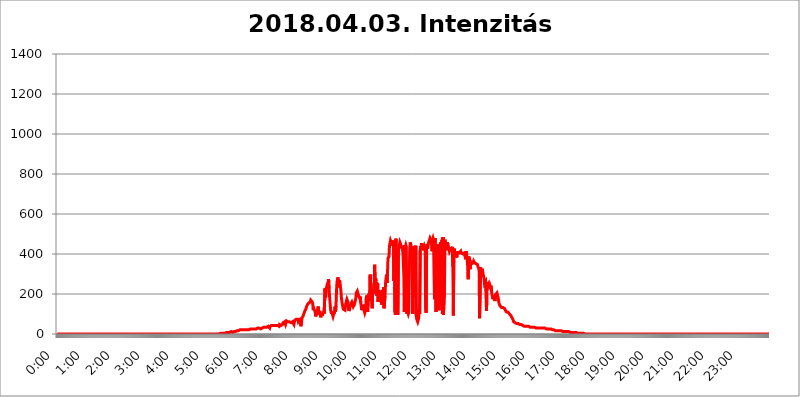
| Category | 2018.04.03. Intenzitás [W/m^2] |
|---|---|
| 0.0 | 0 |
| 0.0006944444444444445 | 0 |
| 0.001388888888888889 | 0 |
| 0.0020833333333333333 | 0 |
| 0.002777777777777778 | 0 |
| 0.003472222222222222 | 0 |
| 0.004166666666666667 | 0 |
| 0.004861111111111111 | 0 |
| 0.005555555555555556 | 0 |
| 0.0062499999999999995 | 0 |
| 0.006944444444444444 | 0 |
| 0.007638888888888889 | 0 |
| 0.008333333333333333 | 0 |
| 0.009027777777777779 | 0 |
| 0.009722222222222222 | 0 |
| 0.010416666666666666 | 0 |
| 0.011111111111111112 | 0 |
| 0.011805555555555555 | 0 |
| 0.012499999999999999 | 0 |
| 0.013194444444444444 | 0 |
| 0.013888888888888888 | 0 |
| 0.014583333333333332 | 0 |
| 0.015277777777777777 | 0 |
| 0.015972222222222224 | 0 |
| 0.016666666666666666 | 0 |
| 0.017361111111111112 | 0 |
| 0.018055555555555557 | 0 |
| 0.01875 | 0 |
| 0.019444444444444445 | 0 |
| 0.02013888888888889 | 0 |
| 0.020833333333333332 | 0 |
| 0.02152777777777778 | 0 |
| 0.022222222222222223 | 0 |
| 0.02291666666666667 | 0 |
| 0.02361111111111111 | 0 |
| 0.024305555555555556 | 0 |
| 0.024999999999999998 | 0 |
| 0.025694444444444447 | 0 |
| 0.02638888888888889 | 0 |
| 0.027083333333333334 | 0 |
| 0.027777777777777776 | 0 |
| 0.02847222222222222 | 0 |
| 0.029166666666666664 | 0 |
| 0.029861111111111113 | 0 |
| 0.030555555555555555 | 0 |
| 0.03125 | 0 |
| 0.03194444444444445 | 0 |
| 0.03263888888888889 | 0 |
| 0.03333333333333333 | 0 |
| 0.034027777777777775 | 0 |
| 0.034722222222222224 | 0 |
| 0.035416666666666666 | 0 |
| 0.036111111111111115 | 0 |
| 0.03680555555555556 | 0 |
| 0.0375 | 0 |
| 0.03819444444444444 | 0 |
| 0.03888888888888889 | 0 |
| 0.03958333333333333 | 0 |
| 0.04027777777777778 | 0 |
| 0.04097222222222222 | 0 |
| 0.041666666666666664 | 0 |
| 0.042361111111111106 | 0 |
| 0.04305555555555556 | 0 |
| 0.043750000000000004 | 0 |
| 0.044444444444444446 | 0 |
| 0.04513888888888889 | 0 |
| 0.04583333333333334 | 0 |
| 0.04652777777777778 | 0 |
| 0.04722222222222222 | 0 |
| 0.04791666666666666 | 0 |
| 0.04861111111111111 | 0 |
| 0.049305555555555554 | 0 |
| 0.049999999999999996 | 0 |
| 0.05069444444444445 | 0 |
| 0.051388888888888894 | 0 |
| 0.052083333333333336 | 0 |
| 0.05277777777777778 | 0 |
| 0.05347222222222222 | 0 |
| 0.05416666666666667 | 0 |
| 0.05486111111111111 | 0 |
| 0.05555555555555555 | 0 |
| 0.05625 | 0 |
| 0.05694444444444444 | 0 |
| 0.057638888888888885 | 0 |
| 0.05833333333333333 | 0 |
| 0.05902777777777778 | 0 |
| 0.059722222222222225 | 0 |
| 0.06041666666666667 | 0 |
| 0.061111111111111116 | 0 |
| 0.06180555555555556 | 0 |
| 0.0625 | 0 |
| 0.06319444444444444 | 0 |
| 0.06388888888888888 | 0 |
| 0.06458333333333334 | 0 |
| 0.06527777777777778 | 0 |
| 0.06597222222222222 | 0 |
| 0.06666666666666667 | 0 |
| 0.06736111111111111 | 0 |
| 0.06805555555555555 | 0 |
| 0.06874999999999999 | 0 |
| 0.06944444444444443 | 0 |
| 0.07013888888888889 | 0 |
| 0.07083333333333333 | 0 |
| 0.07152777777777779 | 0 |
| 0.07222222222222223 | 0 |
| 0.07291666666666667 | 0 |
| 0.07361111111111111 | 0 |
| 0.07430555555555556 | 0 |
| 0.075 | 0 |
| 0.07569444444444444 | 0 |
| 0.0763888888888889 | 0 |
| 0.07708333333333334 | 0 |
| 0.07777777777777778 | 0 |
| 0.07847222222222222 | 0 |
| 0.07916666666666666 | 0 |
| 0.0798611111111111 | 0 |
| 0.08055555555555556 | 0 |
| 0.08125 | 0 |
| 0.08194444444444444 | 0 |
| 0.08263888888888889 | 0 |
| 0.08333333333333333 | 0 |
| 0.08402777777777777 | 0 |
| 0.08472222222222221 | 0 |
| 0.08541666666666665 | 0 |
| 0.08611111111111112 | 0 |
| 0.08680555555555557 | 0 |
| 0.08750000000000001 | 0 |
| 0.08819444444444445 | 0 |
| 0.08888888888888889 | 0 |
| 0.08958333333333333 | 0 |
| 0.09027777777777778 | 0 |
| 0.09097222222222222 | 0 |
| 0.09166666666666667 | 0 |
| 0.09236111111111112 | 0 |
| 0.09305555555555556 | 0 |
| 0.09375 | 0 |
| 0.09444444444444444 | 0 |
| 0.09513888888888888 | 0 |
| 0.09583333333333333 | 0 |
| 0.09652777777777777 | 0 |
| 0.09722222222222222 | 0 |
| 0.09791666666666667 | 0 |
| 0.09861111111111111 | 0 |
| 0.09930555555555555 | 0 |
| 0.09999999999999999 | 0 |
| 0.10069444444444443 | 0 |
| 0.1013888888888889 | 0 |
| 0.10208333333333335 | 0 |
| 0.10277777777777779 | 0 |
| 0.10347222222222223 | 0 |
| 0.10416666666666667 | 0 |
| 0.10486111111111111 | 0 |
| 0.10555555555555556 | 0 |
| 0.10625 | 0 |
| 0.10694444444444444 | 0 |
| 0.1076388888888889 | 0 |
| 0.10833333333333334 | 0 |
| 0.10902777777777778 | 0 |
| 0.10972222222222222 | 0 |
| 0.1111111111111111 | 0 |
| 0.11180555555555556 | 0 |
| 0.11180555555555556 | 0 |
| 0.1125 | 0 |
| 0.11319444444444444 | 0 |
| 0.11388888888888889 | 0 |
| 0.11458333333333333 | 0 |
| 0.11527777777777777 | 0 |
| 0.11597222222222221 | 0 |
| 0.11666666666666665 | 0 |
| 0.1173611111111111 | 0 |
| 0.11805555555555557 | 0 |
| 0.11944444444444445 | 0 |
| 0.12013888888888889 | 0 |
| 0.12083333333333333 | 0 |
| 0.12152777777777778 | 0 |
| 0.12222222222222223 | 0 |
| 0.12291666666666667 | 0 |
| 0.12291666666666667 | 0 |
| 0.12361111111111112 | 0 |
| 0.12430555555555556 | 0 |
| 0.125 | 0 |
| 0.12569444444444444 | 0 |
| 0.12638888888888888 | 0 |
| 0.12708333333333333 | 0 |
| 0.16875 | 0 |
| 0.12847222222222224 | 0 |
| 0.12916666666666668 | 0 |
| 0.12986111111111112 | 0 |
| 0.13055555555555556 | 0 |
| 0.13125 | 0 |
| 0.13194444444444445 | 0 |
| 0.1326388888888889 | 0 |
| 0.13333333333333333 | 0 |
| 0.13402777777777777 | 0 |
| 0.13402777777777777 | 0 |
| 0.13472222222222222 | 0 |
| 0.13541666666666666 | 0 |
| 0.1361111111111111 | 0 |
| 0.13749999999999998 | 0 |
| 0.13819444444444443 | 0 |
| 0.1388888888888889 | 0 |
| 0.13958333333333334 | 0 |
| 0.14027777777777778 | 0 |
| 0.14097222222222222 | 0 |
| 0.14166666666666666 | 0 |
| 0.1423611111111111 | 0 |
| 0.14305555555555557 | 0 |
| 0.14375000000000002 | 0 |
| 0.14444444444444446 | 0 |
| 0.1451388888888889 | 0 |
| 0.1451388888888889 | 0 |
| 0.14652777777777778 | 0 |
| 0.14722222222222223 | 0 |
| 0.14791666666666667 | 0 |
| 0.1486111111111111 | 0 |
| 0.14930555555555555 | 0 |
| 0.15 | 0 |
| 0.15069444444444444 | 0 |
| 0.15138888888888888 | 0 |
| 0.15208333333333332 | 0 |
| 0.15277777777777776 | 0 |
| 0.15347222222222223 | 0 |
| 0.15416666666666667 | 0 |
| 0.15486111111111112 | 0 |
| 0.15555555555555556 | 0 |
| 0.15625 | 0 |
| 0.15694444444444444 | 0 |
| 0.15763888888888888 | 0 |
| 0.15833333333333333 | 0 |
| 0.15902777777777777 | 0 |
| 0.15972222222222224 | 0 |
| 0.16041666666666668 | 0 |
| 0.16111111111111112 | 0 |
| 0.16180555555555556 | 0 |
| 0.1625 | 0 |
| 0.16319444444444445 | 0 |
| 0.1638888888888889 | 0 |
| 0.16458333333333333 | 0 |
| 0.16527777777777777 | 0 |
| 0.16597222222222222 | 0 |
| 0.16666666666666666 | 0 |
| 0.1673611111111111 | 0 |
| 0.16805555555555554 | 0 |
| 0.16874999999999998 | 0 |
| 0.16944444444444443 | 0 |
| 0.17013888888888887 | 0 |
| 0.1708333333333333 | 0 |
| 0.17152777777777775 | 0 |
| 0.17222222222222225 | 0 |
| 0.1729166666666667 | 0 |
| 0.17361111111111113 | 0 |
| 0.17430555555555557 | 0 |
| 0.17500000000000002 | 0 |
| 0.17569444444444446 | 0 |
| 0.1763888888888889 | 0 |
| 0.17708333333333334 | 0 |
| 0.17777777777777778 | 0 |
| 0.17847222222222223 | 0 |
| 0.17916666666666667 | 0 |
| 0.1798611111111111 | 0 |
| 0.18055555555555555 | 0 |
| 0.18125 | 0 |
| 0.18194444444444444 | 0 |
| 0.1826388888888889 | 0 |
| 0.18333333333333335 | 0 |
| 0.1840277777777778 | 0 |
| 0.18472222222222223 | 0 |
| 0.18541666666666667 | 0 |
| 0.18611111111111112 | 0 |
| 0.18680555555555556 | 0 |
| 0.1875 | 0 |
| 0.18819444444444444 | 0 |
| 0.18888888888888888 | 0 |
| 0.18958333333333333 | 0 |
| 0.19027777777777777 | 0 |
| 0.1909722222222222 | 0 |
| 0.19166666666666665 | 0 |
| 0.19236111111111112 | 0 |
| 0.19305555555555554 | 0 |
| 0.19375 | 0 |
| 0.19444444444444445 | 0 |
| 0.1951388888888889 | 0 |
| 0.19583333333333333 | 0 |
| 0.19652777777777777 | 0 |
| 0.19722222222222222 | 0 |
| 0.19791666666666666 | 0 |
| 0.1986111111111111 | 0 |
| 0.19930555555555554 | 0 |
| 0.19999999999999998 | 0 |
| 0.20069444444444443 | 0 |
| 0.20138888888888887 | 0 |
| 0.2020833333333333 | 0 |
| 0.2027777777777778 | 0 |
| 0.2034722222222222 | 0 |
| 0.2041666666666667 | 0 |
| 0.20486111111111113 | 0 |
| 0.20555555555555557 | 0 |
| 0.20625000000000002 | 0 |
| 0.20694444444444446 | 0 |
| 0.2076388888888889 | 0 |
| 0.20833333333333334 | 0 |
| 0.20902777777777778 | 0 |
| 0.20972222222222223 | 0 |
| 0.21041666666666667 | 0 |
| 0.2111111111111111 | 0 |
| 0.21180555555555555 | 0 |
| 0.2125 | 0 |
| 0.21319444444444444 | 0 |
| 0.2138888888888889 | 0 |
| 0.21458333333333335 | 0 |
| 0.2152777777777778 | 0 |
| 0.21597222222222223 | 0 |
| 0.21666666666666667 | 0 |
| 0.21736111111111112 | 0 |
| 0.21805555555555556 | 0 |
| 0.21875 | 0 |
| 0.21944444444444444 | 0 |
| 0.22013888888888888 | 0 |
| 0.22083333333333333 | 0 |
| 0.22152777777777777 | 0 |
| 0.2222222222222222 | 0 |
| 0.22291666666666665 | 0 |
| 0.2236111111111111 | 0 |
| 0.22430555555555556 | 0 |
| 0.225 | 0 |
| 0.22569444444444445 | 0 |
| 0.2263888888888889 | 0 |
| 0.22708333333333333 | 0 |
| 0.22777777777777777 | 0 |
| 0.22847222222222222 | 0 |
| 0.22916666666666666 | 3.525 |
| 0.2298611111111111 | 3.525 |
| 0.23055555555555554 | 3.525 |
| 0.23124999999999998 | 3.525 |
| 0.23194444444444443 | 3.525 |
| 0.23263888888888887 | 3.525 |
| 0.2333333333333333 | 3.525 |
| 0.2340277777777778 | 3.525 |
| 0.2347222222222222 | 3.525 |
| 0.2354166666666667 | 3.525 |
| 0.23611111111111113 | 3.525 |
| 0.23680555555555557 | 7.887 |
| 0.23750000000000002 | 7.887 |
| 0.23819444444444446 | 7.887 |
| 0.2388888888888889 | 7.887 |
| 0.23958333333333334 | 7.887 |
| 0.24027777777777778 | 7.887 |
| 0.24097222222222223 | 7.887 |
| 0.24166666666666667 | 7.887 |
| 0.2423611111111111 | 7.887 |
| 0.24305555555555555 | 12.257 |
| 0.24375 | 12.257 |
| 0.24444444444444446 | 12.257 |
| 0.24513888888888888 | 12.257 |
| 0.24583333333333335 | 7.887 |
| 0.2465277777777778 | 12.257 |
| 0.24722222222222223 | 12.257 |
| 0.24791666666666667 | 12.257 |
| 0.24861111111111112 | 12.257 |
| 0.24930555555555556 | 12.257 |
| 0.25 | 12.257 |
| 0.25069444444444444 | 16.636 |
| 0.2513888888888889 | 16.636 |
| 0.2520833333333333 | 16.636 |
| 0.25277777777777777 | 16.636 |
| 0.2534722222222222 | 16.636 |
| 0.25416666666666665 | 16.636 |
| 0.2548611111111111 | 16.636 |
| 0.2555555555555556 | 16.636 |
| 0.25625000000000003 | 21.024 |
| 0.2569444444444445 | 21.024 |
| 0.2576388888888889 | 21.024 |
| 0.25833333333333336 | 21.024 |
| 0.2590277777777778 | 21.024 |
| 0.25972222222222224 | 21.024 |
| 0.2604166666666667 | 21.024 |
| 0.2611111111111111 | 21.024 |
| 0.26180555555555557 | 21.024 |
| 0.2625 | 21.024 |
| 0.26319444444444445 | 21.024 |
| 0.2638888888888889 | 21.024 |
| 0.26458333333333334 | 21.024 |
| 0.2652777777777778 | 21.024 |
| 0.2659722222222222 | 21.024 |
| 0.26666666666666666 | 21.024 |
| 0.2673611111111111 | 21.024 |
| 0.26805555555555555 | 21.024 |
| 0.26875 | 21.024 |
| 0.26944444444444443 | 25.419 |
| 0.2701388888888889 | 25.419 |
| 0.2708333333333333 | 25.419 |
| 0.27152777777777776 | 29.823 |
| 0.2722222222222222 | 25.419 |
| 0.27291666666666664 | 25.419 |
| 0.2736111111111111 | 25.419 |
| 0.2743055555555555 | 25.419 |
| 0.27499999999999997 | 25.419 |
| 0.27569444444444446 | 25.419 |
| 0.27638888888888885 | 25.419 |
| 0.27708333333333335 | 25.419 |
| 0.2777777777777778 | 25.419 |
| 0.27847222222222223 | 25.419 |
| 0.2791666666666667 | 25.419 |
| 0.2798611111111111 | 25.419 |
| 0.28055555555555556 | 25.419 |
| 0.28125 | 29.823 |
| 0.28194444444444444 | 25.419 |
| 0.2826388888888889 | 29.823 |
| 0.2833333333333333 | 29.823 |
| 0.28402777777777777 | 25.419 |
| 0.2847222222222222 | 25.419 |
| 0.28541666666666665 | 25.419 |
| 0.28611111111111115 | 25.419 |
| 0.28680555555555554 | 29.823 |
| 0.28750000000000003 | 29.823 |
| 0.2881944444444445 | 29.823 |
| 0.2888888888888889 | 34.234 |
| 0.28958333333333336 | 34.234 |
| 0.2902777777777778 | 34.234 |
| 0.29097222222222224 | 34.234 |
| 0.2916666666666667 | 34.234 |
| 0.2923611111111111 | 38.653 |
| 0.29305555555555557 | 38.653 |
| 0.29375 | 34.234 |
| 0.29444444444444445 | 38.653 |
| 0.2951388888888889 | 34.234 |
| 0.29583333333333334 | 38.653 |
| 0.2965277777777778 | 38.653 |
| 0.2972222222222222 | 38.653 |
| 0.29791666666666666 | 29.823 |
| 0.2986111111111111 | 38.653 |
| 0.29930555555555555 | 38.653 |
| 0.3 | 43.079 |
| 0.30069444444444443 | 43.079 |
| 0.3013888888888889 | 43.079 |
| 0.3020833333333333 | 43.079 |
| 0.30277777777777776 | 43.079 |
| 0.3034722222222222 | 43.079 |
| 0.30416666666666664 | 43.079 |
| 0.3048611111111111 | 43.079 |
| 0.3055555555555555 | 43.079 |
| 0.30624999999999997 | 43.079 |
| 0.3069444444444444 | 43.079 |
| 0.3076388888888889 | 43.079 |
| 0.30833333333333335 | 43.079 |
| 0.3090277777777778 | 43.079 |
| 0.30972222222222223 | 43.079 |
| 0.3104166666666667 | 43.079 |
| 0.3111111111111111 | 38.653 |
| 0.31180555555555556 | 47.511 |
| 0.3125 | 47.511 |
| 0.31319444444444444 | 51.951 |
| 0.3138888888888889 | 43.079 |
| 0.3145833333333333 | 43.079 |
| 0.31527777777777777 | 38.653 |
| 0.3159722222222222 | 47.511 |
| 0.31666666666666665 | 56.398 |
| 0.31736111111111115 | 60.85 |
| 0.31805555555555554 | 51.951 |
| 0.31875000000000003 | 60.85 |
| 0.3194444444444445 | 56.398 |
| 0.3201388888888889 | 47.511 |
| 0.32083333333333336 | 56.398 |
| 0.3215277777777778 | 65.31 |
| 0.32222222222222224 | 60.85 |
| 0.3229166666666667 | 60.85 |
| 0.3236111111111111 | 60.85 |
| 0.32430555555555557 | 56.398 |
| 0.325 | 56.398 |
| 0.32569444444444445 | 60.85 |
| 0.3263888888888889 | 60.85 |
| 0.32708333333333334 | 60.85 |
| 0.3277777777777778 | 56.398 |
| 0.3284722222222222 | 51.951 |
| 0.32916666666666666 | 56.398 |
| 0.3298611111111111 | 60.85 |
| 0.33055555555555555 | 60.85 |
| 0.33125 | 60.85 |
| 0.33194444444444443 | 47.511 |
| 0.3326388888888889 | 60.85 |
| 0.3333333333333333 | 69.775 |
| 0.3340277777777778 | 69.775 |
| 0.3347222222222222 | 74.246 |
| 0.3354166666666667 | 74.246 |
| 0.3361111111111111 | 74.246 |
| 0.3368055555555556 | 74.246 |
| 0.33749999999999997 | 74.246 |
| 0.33819444444444446 | 60.85 |
| 0.33888888888888885 | 65.31 |
| 0.33958333333333335 | 65.31 |
| 0.34027777777777773 | 69.775 |
| 0.34097222222222223 | 56.398 |
| 0.3416666666666666 | 38.653 |
| 0.3423611111111111 | 51.951 |
| 0.3430555555555555 | 74.246 |
| 0.34375 | 83.205 |
| 0.3444444444444445 | 87.692 |
| 0.3451388888888889 | 92.184 |
| 0.3458333333333334 | 101.184 |
| 0.34652777777777777 | 105.69 |
| 0.34722222222222227 | 114.716 |
| 0.34791666666666665 | 119.235 |
| 0.34861111111111115 | 123.758 |
| 0.34930555555555554 | 132.814 |
| 0.35000000000000003 | 137.347 |
| 0.3506944444444444 | 146.423 |
| 0.3513888888888889 | 150.964 |
| 0.3520833333333333 | 150.964 |
| 0.3527777777777778 | 155.509 |
| 0.3534722222222222 | 155.509 |
| 0.3541666666666667 | 160.056 |
| 0.3548611111111111 | 160.056 |
| 0.35555555555555557 | 169.156 |
| 0.35625 | 173.709 |
| 0.35694444444444445 | 173.709 |
| 0.3576388888888889 | 160.056 |
| 0.35833333333333334 | 150.964 |
| 0.3590277777777778 | 119.235 |
| 0.3597222222222222 | 128.284 |
| 0.36041666666666666 | 128.284 |
| 0.3611111111111111 | 123.758 |
| 0.36180555555555555 | 110.201 |
| 0.3625 | 87.692 |
| 0.36319444444444443 | 101.184 |
| 0.3638888888888889 | 101.184 |
| 0.3645833333333333 | 110.201 |
| 0.3652777777777778 | 114.716 |
| 0.3659722222222222 | 137.347 |
| 0.3666666666666667 | 137.347 |
| 0.3673611111111111 | 96.682 |
| 0.3680555555555556 | 114.716 |
| 0.36874999999999997 | 101.184 |
| 0.36944444444444446 | 83.205 |
| 0.37013888888888885 | 96.682 |
| 0.37083333333333335 | 92.184 |
| 0.37152777777777773 | 92.184 |
| 0.37222222222222223 | 96.682 |
| 0.3729166666666666 | 96.682 |
| 0.3736111111111111 | 110.201 |
| 0.3743055555555555 | 101.184 |
| 0.375 | 105.69 |
| 0.3756944444444445 | 228.436 |
| 0.3763888888888889 | 182.82 |
| 0.3770833333333334 | 223.873 |
| 0.37777777777777777 | 223.873 |
| 0.37847222222222227 | 228.436 |
| 0.37916666666666665 | 255.813 |
| 0.37986111111111115 | 246.689 |
| 0.38055555555555554 | 274.047 |
| 0.38125000000000003 | 223.873 |
| 0.3819444444444444 | 187.378 |
| 0.3826388888888889 | 155.509 |
| 0.3833333333333333 | 123.758 |
| 0.3840277777777778 | 110.201 |
| 0.3847222222222222 | 101.184 |
| 0.3854166666666667 | 114.716 |
| 0.3861111111111111 | 96.682 |
| 0.38680555555555557 | 87.692 |
| 0.3875 | 96.682 |
| 0.38819444444444445 | 92.184 |
| 0.3888888888888889 | 105.69 |
| 0.38958333333333334 | 137.347 |
| 0.3902777777777778 | 110.201 |
| 0.3909722222222222 | 141.884 |
| 0.39166666666666666 | 214.746 |
| 0.3923611111111111 | 260.373 |
| 0.39305555555555555 | 269.49 |
| 0.39375 | 283.156 |
| 0.39444444444444443 | 251.251 |
| 0.3951388888888889 | 233 |
| 0.3958333333333333 | 269.49 |
| 0.3965277777777778 | 255.813 |
| 0.3972222222222222 | 251.251 |
| 0.3979166666666667 | 214.746 |
| 0.3986111111111111 | 178.264 |
| 0.3993055555555556 | 160.056 |
| 0.39999999999999997 | 146.423 |
| 0.40069444444444446 | 132.814 |
| 0.40138888888888885 | 123.758 |
| 0.40208333333333335 | 128.284 |
| 0.40277777777777773 | 123.758 |
| 0.40347222222222223 | 119.235 |
| 0.4041666666666666 | 137.347 |
| 0.4048611111111111 | 155.509 |
| 0.4055555555555555 | 164.605 |
| 0.40625 | 173.709 |
| 0.4069444444444445 | 169.156 |
| 0.4076388888888889 | 160.056 |
| 0.4083333333333334 | 132.814 |
| 0.40902777777777777 | 114.716 |
| 0.40972222222222227 | 114.716 |
| 0.41041666666666665 | 132.814 |
| 0.41111111111111115 | 141.884 |
| 0.41180555555555554 | 150.964 |
| 0.41250000000000003 | 150.964 |
| 0.4131944444444444 | 160.056 |
| 0.4138888888888889 | 155.509 |
| 0.4145833333333333 | 146.423 |
| 0.4152777777777778 | 137.347 |
| 0.4159722222222222 | 132.814 |
| 0.4166666666666667 | 146.423 |
| 0.4173611111111111 | 155.509 |
| 0.41805555555555557 | 160.056 |
| 0.41875 | 178.264 |
| 0.41944444444444445 | 205.62 |
| 0.4201388888888889 | 210.182 |
| 0.42083333333333334 | 214.746 |
| 0.4215277777777778 | 219.309 |
| 0.4222222222222222 | 196.497 |
| 0.42291666666666666 | 191.937 |
| 0.4236111111111111 | 191.937 |
| 0.42430555555555555 | 178.264 |
| 0.425 | 187.378 |
| 0.42569444444444443 | 155.509 |
| 0.4263888888888889 | 137.347 |
| 0.4270833333333333 | 119.235 |
| 0.4277777777777778 | 132.814 |
| 0.4284722222222222 | 146.423 |
| 0.4291666666666667 | 137.347 |
| 0.4298611111111111 | 128.284 |
| 0.4305555555555556 | 114.716 |
| 0.43124999999999997 | 105.69 |
| 0.43194444444444446 | 114.716 |
| 0.43263888888888885 | 132.814 |
| 0.43333333333333335 | 182.82 |
| 0.43402777777777773 | 191.937 |
| 0.43472222222222223 | 123.758 |
| 0.4354166666666666 | 110.201 |
| 0.4361111111111111 | 191.937 |
| 0.4368055555555555 | 201.058 |
| 0.4375 | 173.709 |
| 0.4381944444444445 | 164.605 |
| 0.4388888888888889 | 296.808 |
| 0.4395833333333334 | 292.259 |
| 0.44027777777777777 | 292.259 |
| 0.44097222222222227 | 169.156 |
| 0.44166666666666665 | 128.284 |
| 0.44236111111111115 | 219.309 |
| 0.44305555555555554 | 210.182 |
| 0.44375000000000003 | 201.058 |
| 0.4444444444444444 | 251.251 |
| 0.4451388888888889 | 346.682 |
| 0.4458333333333333 | 269.49 |
| 0.4465277777777778 | 278.603 |
| 0.4472222222222222 | 264.932 |
| 0.4479166666666667 | 191.937 |
| 0.4486111111111111 | 228.436 |
| 0.44930555555555557 | 255.813 |
| 0.45 | 160.056 |
| 0.45069444444444445 | 182.82 |
| 0.4513888888888889 | 219.309 |
| 0.45208333333333334 | 173.709 |
| 0.4527777777777778 | 196.497 |
| 0.4534722222222222 | 196.497 |
| 0.45416666666666666 | 169.156 |
| 0.4548611111111111 | 146.423 |
| 0.45555555555555555 | 191.937 |
| 0.45625 | 219.309 |
| 0.45694444444444443 | 205.62 |
| 0.4576388888888889 | 233 |
| 0.4583333333333333 | 128.284 |
| 0.4590277777777778 | 128.284 |
| 0.4597222222222222 | 191.937 |
| 0.4604166666666667 | 251.251 |
| 0.4611111111111111 | 278.603 |
| 0.4618055555555556 | 296.808 |
| 0.46249999999999997 | 255.813 |
| 0.46319444444444446 | 305.898 |
| 0.46388888888888885 | 378.224 |
| 0.46458333333333335 | 373.729 |
| 0.46527777777777773 | 387.202 |
| 0.46597222222222223 | 440.702 |
| 0.4666666666666666 | 453.968 |
| 0.4673611111111111 | 467.187 |
| 0.4680555555555555 | 462.786 |
| 0.46875 | 453.968 |
| 0.4694444444444445 | 440.702 |
| 0.4701388888888889 | 436.27 |
| 0.4708333333333334 | 458.38 |
| 0.47152777777777777 | 467.187 |
| 0.47222222222222227 | 264.932 |
| 0.47291666666666665 | 445.129 |
| 0.47361111111111115 | 110.201 |
| 0.47430555555555554 | 96.682 |
| 0.47500000000000003 | 475.972 |
| 0.4756944444444444 | 119.235 |
| 0.4763888888888889 | 119.235 |
| 0.4770833333333333 | 114.716 |
| 0.4777777777777778 | 96.682 |
| 0.4784722222222222 | 414.035 |
| 0.4791666666666667 | 431.833 |
| 0.4798611111111111 | 436.27 |
| 0.48055555555555557 | 458.38 |
| 0.48125 | 462.786 |
| 0.48194444444444445 | 445.129 |
| 0.4826388888888889 | 427.39 |
| 0.48333333333333334 | 431.833 |
| 0.4840277777777778 | 440.702 |
| 0.4847222222222222 | 414.035 |
| 0.48541666666666666 | 409.574 |
| 0.4861111111111111 | 292.259 |
| 0.48680555555555555 | 110.201 |
| 0.4875 | 445.129 |
| 0.48819444444444443 | 436.27 |
| 0.4888888888888889 | 445.129 |
| 0.4895833333333333 | 436.27 |
| 0.4902777777777778 | 101.184 |
| 0.4909722222222222 | 119.235 |
| 0.4916666666666667 | 114.716 |
| 0.4923611111111111 | 101.184 |
| 0.4930555555555556 | 110.201 |
| 0.49374999999999997 | 301.354 |
| 0.49444444444444446 | 431.833 |
| 0.49513888888888885 | 458.38 |
| 0.49583333333333335 | 445.129 |
| 0.49652777777777773 | 418.492 |
| 0.49722222222222223 | 409.574 |
| 0.4979166666666666 | 418.492 |
| 0.4986111111111111 | 101.184 |
| 0.4993055555555555 | 278.603 |
| 0.5 | 440.702 |
| 0.5006944444444444 | 422.943 |
| 0.5013888888888889 | 431.833 |
| 0.5020833333333333 | 187.378 |
| 0.5027777777777778 | 440.702 |
| 0.5034722222222222 | 92.184 |
| 0.5041666666666667 | 74.246 |
| 0.5048611111111111 | 69.775 |
| 0.5055555555555555 | 60.85 |
| 0.50625 | 60.85 |
| 0.5069444444444444 | 78.722 |
| 0.5076388888888889 | 123.758 |
| 0.5083333333333333 | 101.184 |
| 0.5090277777777777 | 418.492 |
| 0.5097222222222222 | 440.702 |
| 0.5104166666666666 | 431.833 |
| 0.5111111111111112 | 453.968 |
| 0.5118055555555555 | 436.27 |
| 0.5125000000000001 | 418.492 |
| 0.5131944444444444 | 427.39 |
| 0.513888888888889 | 427.39 |
| 0.5145833333333333 | 440.702 |
| 0.5152777777777778 | 431.833 |
| 0.5159722222222222 | 422.943 |
| 0.5166666666666667 | 128.284 |
| 0.517361111111111 | 105.69 |
| 0.5180555555555556 | 431.833 |
| 0.5187499999999999 | 449.551 |
| 0.5194444444444445 | 427.39 |
| 0.5201388888888888 | 449.551 |
| 0.5208333333333334 | 453.968 |
| 0.5215277777777778 | 453.968 |
| 0.5222222222222223 | 471.582 |
| 0.5229166666666667 | 480.356 |
| 0.5236111111111111 | 484.735 |
| 0.5243055555555556 | 471.582 |
| 0.525 | 449.551 |
| 0.5256944444444445 | 414.035 |
| 0.5263888888888889 | 471.582 |
| 0.5270833333333333 | 480.356 |
| 0.5277777777777778 | 471.582 |
| 0.5284722222222222 | 301.354 |
| 0.5291666666666667 | 173.709 |
| 0.5298611111111111 | 480.356 |
| 0.5305555555555556 | 301.354 |
| 0.53125 | 110.201 |
| 0.5319444444444444 | 440.702 |
| 0.5326388888888889 | 440.702 |
| 0.5333333333333333 | 445.129 |
| 0.5340277777777778 | 431.833 |
| 0.5347222222222222 | 449.551 |
| 0.5354166666666667 | 119.235 |
| 0.5361111111111111 | 400.638 |
| 0.5368055555555555 | 436.27 |
| 0.5375 | 458.38 |
| 0.5381944444444444 | 146.423 |
| 0.5388888888888889 | 445.129 |
| 0.5395833333333333 | 471.582 |
| 0.5402777777777777 | 101.184 |
| 0.5409722222222222 | 484.735 |
| 0.5416666666666666 | 96.682 |
| 0.5423611111111112 | 101.184 |
| 0.5430555555555555 | 219.309 |
| 0.5437500000000001 | 471.582 |
| 0.5444444444444444 | 453.968 |
| 0.545138888888889 | 436.27 |
| 0.5458333333333333 | 418.492 |
| 0.5465277777777778 | 422.943 |
| 0.5472222222222222 | 458.38 |
| 0.5479166666666667 | 449.551 |
| 0.548611111111111 | 449.551 |
| 0.5493055555555556 | 449.551 |
| 0.5499999999999999 | 414.035 |
| 0.5506944444444445 | 409.574 |
| 0.5513888888888888 | 427.39 |
| 0.5520833333333334 | 431.833 |
| 0.5527777777777778 | 422.943 |
| 0.5534722222222223 | 427.39 |
| 0.5541666666666667 | 436.27 |
| 0.5548611111111111 | 337.639 |
| 0.5555555555555556 | 92.184 |
| 0.55625 | 400.638 |
| 0.5569444444444445 | 427.39 |
| 0.5576388888888889 | 391.685 |
| 0.5583333333333333 | 405.108 |
| 0.5590277777777778 | 409.574 |
| 0.5597222222222222 | 409.574 |
| 0.5604166666666667 | 382.715 |
| 0.5611111111111111 | 414.035 |
| 0.5618055555555556 | 405.108 |
| 0.5625 | 405.108 |
| 0.5631944444444444 | 405.108 |
| 0.5638888888888889 | 405.108 |
| 0.5645833333333333 | 400.638 |
| 0.5652777777777778 | 405.108 |
| 0.5659722222222222 | 414.035 |
| 0.5666666666666667 | 405.108 |
| 0.5673611111111111 | 400.638 |
| 0.5680555555555555 | 405.108 |
| 0.56875 | 400.638 |
| 0.5694444444444444 | 405.108 |
| 0.5701388888888889 | 400.638 |
| 0.5708333333333333 | 405.108 |
| 0.5715277777777777 | 405.108 |
| 0.5722222222222222 | 405.108 |
| 0.5729166666666666 | 373.729 |
| 0.5736111111111112 | 414.035 |
| 0.5743055555555555 | 396.164 |
| 0.5750000000000001 | 400.638 |
| 0.5756944444444444 | 337.639 |
| 0.576388888888889 | 274.047 |
| 0.5770833333333333 | 387.202 |
| 0.5777777777777778 | 387.202 |
| 0.5784722222222222 | 369.23 |
| 0.5791666666666667 | 324.052 |
| 0.579861111111111 | 360.221 |
| 0.5805555555555556 | 360.221 |
| 0.5812499999999999 | 351.198 |
| 0.5819444444444445 | 346.682 |
| 0.5826388888888888 | 346.682 |
| 0.5833333333333334 | 355.712 |
| 0.5840277777777778 | 364.728 |
| 0.5847222222222223 | 360.221 |
| 0.5854166666666667 | 355.712 |
| 0.5861111111111111 | 360.221 |
| 0.5868055555555556 | 355.712 |
| 0.5875 | 351.198 |
| 0.5881944444444445 | 351.198 |
| 0.5888888888888889 | 346.682 |
| 0.5895833333333333 | 346.682 |
| 0.5902777777777778 | 333.113 |
| 0.5909722222222222 | 333.113 |
| 0.5916666666666667 | 324.052 |
| 0.5923611111111111 | 78.722 |
| 0.5930555555555556 | 78.722 |
| 0.59375 | 333.113 |
| 0.5944444444444444 | 319.517 |
| 0.5951388888888889 | 314.98 |
| 0.5958333333333333 | 314.98 |
| 0.5965277777777778 | 319.517 |
| 0.5972222222222222 | 301.354 |
| 0.5979166666666667 | 287.709 |
| 0.5986111111111111 | 278.603 |
| 0.5993055555555555 | 251.251 |
| 0.6 | 251.251 |
| 0.6006944444444444 | 260.373 |
| 0.6013888888888889 | 260.373 |
| 0.6020833333333333 | 114.716 |
| 0.6027777777777777 | 260.373 |
| 0.6034722222222222 | 242.127 |
| 0.6041666666666666 | 246.689 |
| 0.6048611111111112 | 251.251 |
| 0.6055555555555555 | 228.436 |
| 0.6062500000000001 | 233 |
| 0.6069444444444444 | 242.127 |
| 0.607638888888889 | 233 |
| 0.6083333333333333 | 242.127 |
| 0.6090277777777778 | 219.309 |
| 0.6097222222222222 | 196.497 |
| 0.6104166666666667 | 191.937 |
| 0.611111111111111 | 173.709 |
| 0.6118055555555556 | 173.709 |
| 0.6124999999999999 | 191.937 |
| 0.6131944444444445 | 173.709 |
| 0.6138888888888888 | 164.605 |
| 0.6145833333333334 | 196.497 |
| 0.6152777777777778 | 196.497 |
| 0.6159722222222223 | 196.497 |
| 0.6166666666666667 | 205.62 |
| 0.6173611111111111 | 196.497 |
| 0.6180555555555556 | 187.378 |
| 0.61875 | 173.709 |
| 0.6194444444444445 | 155.509 |
| 0.6201388888888889 | 150.964 |
| 0.6208333333333333 | 141.884 |
| 0.6215277777777778 | 137.347 |
| 0.6222222222222222 | 137.347 |
| 0.6229166666666667 | 132.814 |
| 0.6236111111111111 | 137.347 |
| 0.6243055555555556 | 132.814 |
| 0.625 | 132.814 |
| 0.6256944444444444 | 137.347 |
| 0.6263888888888889 | 128.284 |
| 0.6270833333333333 | 128.284 |
| 0.6277777777777778 | 123.758 |
| 0.6284722222222222 | 119.235 |
| 0.6291666666666667 | 114.716 |
| 0.6298611111111111 | 110.201 |
| 0.6305555555555555 | 110.201 |
| 0.63125 | 110.201 |
| 0.6319444444444444 | 110.201 |
| 0.6326388888888889 | 105.69 |
| 0.6333333333333333 | 105.69 |
| 0.6340277777777777 | 101.184 |
| 0.6347222222222222 | 96.682 |
| 0.6354166666666666 | 96.682 |
| 0.6361111111111112 | 92.184 |
| 0.6368055555555555 | 92.184 |
| 0.6375000000000001 | 83.205 |
| 0.6381944444444444 | 78.722 |
| 0.638888888888889 | 74.246 |
| 0.6395833333333333 | 69.775 |
| 0.6402777777777778 | 60.85 |
| 0.6409722222222222 | 60.85 |
| 0.6416666666666667 | 56.398 |
| 0.642361111111111 | 56.398 |
| 0.6430555555555556 | 51.951 |
| 0.6437499999999999 | 51.951 |
| 0.6444444444444445 | 51.951 |
| 0.6451388888888888 | 47.511 |
| 0.6458333333333334 | 51.951 |
| 0.6465277777777778 | 51.951 |
| 0.6472222222222223 | 47.511 |
| 0.6479166666666667 | 47.511 |
| 0.6486111111111111 | 47.511 |
| 0.6493055555555556 | 47.511 |
| 0.65 | 47.511 |
| 0.6506944444444445 | 47.511 |
| 0.6513888888888889 | 47.511 |
| 0.6520833333333333 | 43.079 |
| 0.6527777777777778 | 43.079 |
| 0.6534722222222222 | 43.079 |
| 0.6541666666666667 | 38.653 |
| 0.6548611111111111 | 38.653 |
| 0.6555555555555556 | 38.653 |
| 0.65625 | 38.653 |
| 0.6569444444444444 | 38.653 |
| 0.6576388888888889 | 38.653 |
| 0.6583333333333333 | 38.653 |
| 0.6590277777777778 | 38.653 |
| 0.6597222222222222 | 38.653 |
| 0.6604166666666667 | 38.653 |
| 0.6611111111111111 | 38.653 |
| 0.6618055555555555 | 38.653 |
| 0.6625 | 38.653 |
| 0.6631944444444444 | 34.234 |
| 0.6638888888888889 | 34.234 |
| 0.6645833333333333 | 34.234 |
| 0.6652777777777777 | 34.234 |
| 0.6659722222222222 | 34.234 |
| 0.6666666666666666 | 34.234 |
| 0.6673611111111111 | 34.234 |
| 0.6680555555555556 | 34.234 |
| 0.6687500000000001 | 34.234 |
| 0.6694444444444444 | 34.234 |
| 0.6701388888888888 | 34.234 |
| 0.6708333333333334 | 29.823 |
| 0.6715277777777778 | 29.823 |
| 0.6722222222222222 | 29.823 |
| 0.6729166666666666 | 29.823 |
| 0.6736111111111112 | 29.823 |
| 0.6743055555555556 | 29.823 |
| 0.6749999999999999 | 29.823 |
| 0.6756944444444444 | 29.823 |
| 0.6763888888888889 | 29.823 |
| 0.6770833333333334 | 29.823 |
| 0.6777777777777777 | 29.823 |
| 0.6784722222222223 | 29.823 |
| 0.6791666666666667 | 29.823 |
| 0.6798611111111111 | 29.823 |
| 0.6805555555555555 | 29.823 |
| 0.68125 | 29.823 |
| 0.6819444444444445 | 29.823 |
| 0.6826388888888889 | 29.823 |
| 0.6833333333333332 | 25.419 |
| 0.6840277777777778 | 29.823 |
| 0.6847222222222222 | 25.419 |
| 0.6854166666666667 | 29.823 |
| 0.686111111111111 | 25.419 |
| 0.6868055555555556 | 25.419 |
| 0.6875 | 25.419 |
| 0.6881944444444444 | 25.419 |
| 0.688888888888889 | 25.419 |
| 0.6895833333333333 | 25.419 |
| 0.6902777777777778 | 25.419 |
| 0.6909722222222222 | 25.419 |
| 0.6916666666666668 | 25.419 |
| 0.6923611111111111 | 25.419 |
| 0.6930555555555555 | 21.024 |
| 0.69375 | 21.024 |
| 0.6944444444444445 | 21.024 |
| 0.6951388888888889 | 21.024 |
| 0.6958333333333333 | 21.024 |
| 0.6965277777777777 | 21.024 |
| 0.6972222222222223 | 21.024 |
| 0.6979166666666666 | 21.024 |
| 0.6986111111111111 | 16.636 |
| 0.6993055555555556 | 16.636 |
| 0.7000000000000001 | 16.636 |
| 0.7006944444444444 | 16.636 |
| 0.7013888888888888 | 16.636 |
| 0.7020833333333334 | 16.636 |
| 0.7027777777777778 | 16.636 |
| 0.7034722222222222 | 16.636 |
| 0.7041666666666666 | 16.636 |
| 0.7048611111111112 | 16.636 |
| 0.7055555555555556 | 16.636 |
| 0.7062499999999999 | 16.636 |
| 0.7069444444444444 | 16.636 |
| 0.7076388888888889 | 12.257 |
| 0.7083333333333334 | 12.257 |
| 0.7090277777777777 | 12.257 |
| 0.7097222222222223 | 12.257 |
| 0.7104166666666667 | 12.257 |
| 0.7111111111111111 | 12.257 |
| 0.7118055555555555 | 12.257 |
| 0.7125 | 12.257 |
| 0.7131944444444445 | 12.257 |
| 0.7138888888888889 | 12.257 |
| 0.7145833333333332 | 12.257 |
| 0.7152777777777778 | 12.257 |
| 0.7159722222222222 | 12.257 |
| 0.7166666666666667 | 7.887 |
| 0.717361111111111 | 12.257 |
| 0.7180555555555556 | 7.887 |
| 0.71875 | 7.887 |
| 0.7194444444444444 | 7.887 |
| 0.720138888888889 | 7.887 |
| 0.7208333333333333 | 7.887 |
| 0.7215277777777778 | 7.887 |
| 0.7222222222222222 | 7.887 |
| 0.7229166666666668 | 7.887 |
| 0.7236111111111111 | 7.887 |
| 0.7243055555555555 | 7.887 |
| 0.725 | 7.887 |
| 0.7256944444444445 | 7.887 |
| 0.7263888888888889 | 7.887 |
| 0.7270833333333333 | 7.887 |
| 0.7277777777777777 | 7.887 |
| 0.7284722222222223 | 7.887 |
| 0.7291666666666666 | 3.525 |
| 0.7298611111111111 | 3.525 |
| 0.7305555555555556 | 7.887 |
| 0.7312500000000001 | 3.525 |
| 0.7319444444444444 | 3.525 |
| 0.7326388888888888 | 3.525 |
| 0.7333333333333334 | 3.525 |
| 0.7340277777777778 | 3.525 |
| 0.7347222222222222 | 3.525 |
| 0.7354166666666666 | 3.525 |
| 0.7361111111111112 | 3.525 |
| 0.7368055555555556 | 3.525 |
| 0.7374999999999999 | 3.525 |
| 0.7381944444444444 | 3.525 |
| 0.7388888888888889 | 3.525 |
| 0.7395833333333334 | 3.525 |
| 0.7402777777777777 | 0 |
| 0.7409722222222223 | 0 |
| 0.7416666666666667 | 0 |
| 0.7423611111111111 | 0 |
| 0.7430555555555555 | 0 |
| 0.74375 | 0 |
| 0.7444444444444445 | 0 |
| 0.7451388888888889 | 0 |
| 0.7458333333333332 | 0 |
| 0.7465277777777778 | 0 |
| 0.7472222222222222 | 0 |
| 0.7479166666666667 | 0 |
| 0.748611111111111 | 0 |
| 0.7493055555555556 | 0 |
| 0.75 | 0 |
| 0.7506944444444444 | 0 |
| 0.751388888888889 | 0 |
| 0.7520833333333333 | 0 |
| 0.7527777777777778 | 0 |
| 0.7534722222222222 | 0 |
| 0.7541666666666668 | 0 |
| 0.7548611111111111 | 0 |
| 0.7555555555555555 | 0 |
| 0.75625 | 0 |
| 0.7569444444444445 | 0 |
| 0.7576388888888889 | 0 |
| 0.7583333333333333 | 0 |
| 0.7590277777777777 | 0 |
| 0.7597222222222223 | 0 |
| 0.7604166666666666 | 0 |
| 0.7611111111111111 | 0 |
| 0.7618055555555556 | 0 |
| 0.7625000000000001 | 0 |
| 0.7631944444444444 | 0 |
| 0.7638888888888888 | 0 |
| 0.7645833333333334 | 0 |
| 0.7652777777777778 | 0 |
| 0.7659722222222222 | 0 |
| 0.7666666666666666 | 0 |
| 0.7673611111111112 | 0 |
| 0.7680555555555556 | 0 |
| 0.7687499999999999 | 0 |
| 0.7694444444444444 | 0 |
| 0.7701388888888889 | 0 |
| 0.7708333333333334 | 0 |
| 0.7715277777777777 | 0 |
| 0.7722222222222223 | 0 |
| 0.7729166666666667 | 0 |
| 0.7736111111111111 | 0 |
| 0.7743055555555555 | 0 |
| 0.775 | 0 |
| 0.7756944444444445 | 0 |
| 0.7763888888888889 | 0 |
| 0.7770833333333332 | 0 |
| 0.7777777777777778 | 0 |
| 0.7784722222222222 | 0 |
| 0.7791666666666667 | 0 |
| 0.779861111111111 | 0 |
| 0.7805555555555556 | 0 |
| 0.78125 | 0 |
| 0.7819444444444444 | 0 |
| 0.782638888888889 | 0 |
| 0.7833333333333333 | 0 |
| 0.7840277777777778 | 0 |
| 0.7847222222222222 | 0 |
| 0.7854166666666668 | 0 |
| 0.7861111111111111 | 0 |
| 0.7868055555555555 | 0 |
| 0.7875 | 0 |
| 0.7881944444444445 | 0 |
| 0.7888888888888889 | 0 |
| 0.7895833333333333 | 0 |
| 0.7902777777777777 | 0 |
| 0.7909722222222223 | 0 |
| 0.7916666666666666 | 0 |
| 0.7923611111111111 | 0 |
| 0.7930555555555556 | 0 |
| 0.7937500000000001 | 0 |
| 0.7944444444444444 | 0 |
| 0.7951388888888888 | 0 |
| 0.7958333333333334 | 0 |
| 0.7965277777777778 | 0 |
| 0.7972222222222222 | 0 |
| 0.7979166666666666 | 0 |
| 0.7986111111111112 | 0 |
| 0.7993055555555556 | 0 |
| 0.7999999999999999 | 0 |
| 0.8006944444444444 | 0 |
| 0.8013888888888889 | 0 |
| 0.8020833333333334 | 0 |
| 0.8027777777777777 | 0 |
| 0.8034722222222223 | 0 |
| 0.8041666666666667 | 0 |
| 0.8048611111111111 | 0 |
| 0.8055555555555555 | 0 |
| 0.80625 | 0 |
| 0.8069444444444445 | 0 |
| 0.8076388888888889 | 0 |
| 0.8083333333333332 | 0 |
| 0.8090277777777778 | 0 |
| 0.8097222222222222 | 0 |
| 0.8104166666666667 | 0 |
| 0.811111111111111 | 0 |
| 0.8118055555555556 | 0 |
| 0.8125 | 0 |
| 0.8131944444444444 | 0 |
| 0.813888888888889 | 0 |
| 0.8145833333333333 | 0 |
| 0.8152777777777778 | 0 |
| 0.8159722222222222 | 0 |
| 0.8166666666666668 | 0 |
| 0.8173611111111111 | 0 |
| 0.8180555555555555 | 0 |
| 0.81875 | 0 |
| 0.8194444444444445 | 0 |
| 0.8201388888888889 | 0 |
| 0.8208333333333333 | 0 |
| 0.8215277777777777 | 0 |
| 0.8222222222222223 | 0 |
| 0.8229166666666666 | 0 |
| 0.8236111111111111 | 0 |
| 0.8243055555555556 | 0 |
| 0.8250000000000001 | 0 |
| 0.8256944444444444 | 0 |
| 0.8263888888888888 | 0 |
| 0.8270833333333334 | 0 |
| 0.8277777777777778 | 0 |
| 0.8284722222222222 | 0 |
| 0.8291666666666666 | 0 |
| 0.8298611111111112 | 0 |
| 0.8305555555555556 | 0 |
| 0.8312499999999999 | 0 |
| 0.8319444444444444 | 0 |
| 0.8326388888888889 | 0 |
| 0.8333333333333334 | 0 |
| 0.8340277777777777 | 0 |
| 0.8347222222222223 | 0 |
| 0.8354166666666667 | 0 |
| 0.8361111111111111 | 0 |
| 0.8368055555555555 | 0 |
| 0.8375 | 0 |
| 0.8381944444444445 | 0 |
| 0.8388888888888889 | 0 |
| 0.8395833333333332 | 0 |
| 0.8402777777777778 | 0 |
| 0.8409722222222222 | 0 |
| 0.8416666666666667 | 0 |
| 0.842361111111111 | 0 |
| 0.8430555555555556 | 0 |
| 0.84375 | 0 |
| 0.8444444444444444 | 0 |
| 0.845138888888889 | 0 |
| 0.8458333333333333 | 0 |
| 0.8465277777777778 | 0 |
| 0.8472222222222222 | 0 |
| 0.8479166666666668 | 0 |
| 0.8486111111111111 | 0 |
| 0.8493055555555555 | 0 |
| 0.85 | 0 |
| 0.8506944444444445 | 0 |
| 0.8513888888888889 | 0 |
| 0.8520833333333333 | 0 |
| 0.8527777777777777 | 0 |
| 0.8534722222222223 | 0 |
| 0.8541666666666666 | 0 |
| 0.8548611111111111 | 0 |
| 0.8555555555555556 | 0 |
| 0.8562500000000001 | 0 |
| 0.8569444444444444 | 0 |
| 0.8576388888888888 | 0 |
| 0.8583333333333334 | 0 |
| 0.8590277777777778 | 0 |
| 0.8597222222222222 | 0 |
| 0.8604166666666666 | 0 |
| 0.8611111111111112 | 0 |
| 0.8618055555555556 | 0 |
| 0.8624999999999999 | 0 |
| 0.8631944444444444 | 0 |
| 0.8638888888888889 | 0 |
| 0.8645833333333334 | 0 |
| 0.8652777777777777 | 0 |
| 0.8659722222222223 | 0 |
| 0.8666666666666667 | 0 |
| 0.8673611111111111 | 0 |
| 0.8680555555555555 | 0 |
| 0.86875 | 0 |
| 0.8694444444444445 | 0 |
| 0.8701388888888889 | 0 |
| 0.8708333333333332 | 0 |
| 0.8715277777777778 | 0 |
| 0.8722222222222222 | 0 |
| 0.8729166666666667 | 0 |
| 0.873611111111111 | 0 |
| 0.8743055555555556 | 0 |
| 0.875 | 0 |
| 0.8756944444444444 | 0 |
| 0.876388888888889 | 0 |
| 0.8770833333333333 | 0 |
| 0.8777777777777778 | 0 |
| 0.8784722222222222 | 0 |
| 0.8791666666666668 | 0 |
| 0.8798611111111111 | 0 |
| 0.8805555555555555 | 0 |
| 0.88125 | 0 |
| 0.8819444444444445 | 0 |
| 0.8826388888888889 | 0 |
| 0.8833333333333333 | 0 |
| 0.8840277777777777 | 0 |
| 0.8847222222222223 | 0 |
| 0.8854166666666666 | 0 |
| 0.8861111111111111 | 0 |
| 0.8868055555555556 | 0 |
| 0.8875000000000001 | 0 |
| 0.8881944444444444 | 0 |
| 0.8888888888888888 | 0 |
| 0.8895833333333334 | 0 |
| 0.8902777777777778 | 0 |
| 0.8909722222222222 | 0 |
| 0.8916666666666666 | 0 |
| 0.8923611111111112 | 0 |
| 0.8930555555555556 | 0 |
| 0.8937499999999999 | 0 |
| 0.8944444444444444 | 0 |
| 0.8951388888888889 | 0 |
| 0.8958333333333334 | 0 |
| 0.8965277777777777 | 0 |
| 0.8972222222222223 | 0 |
| 0.8979166666666667 | 0 |
| 0.8986111111111111 | 0 |
| 0.8993055555555555 | 0 |
| 0.9 | 0 |
| 0.9006944444444445 | 0 |
| 0.9013888888888889 | 0 |
| 0.9020833333333332 | 0 |
| 0.9027777777777778 | 0 |
| 0.9034722222222222 | 0 |
| 0.9041666666666667 | 0 |
| 0.904861111111111 | 0 |
| 0.9055555555555556 | 0 |
| 0.90625 | 0 |
| 0.9069444444444444 | 0 |
| 0.907638888888889 | 0 |
| 0.9083333333333333 | 0 |
| 0.9090277777777778 | 0 |
| 0.9097222222222222 | 0 |
| 0.9104166666666668 | 0 |
| 0.9111111111111111 | 0 |
| 0.9118055555555555 | 0 |
| 0.9125 | 0 |
| 0.9131944444444445 | 0 |
| 0.9138888888888889 | 0 |
| 0.9145833333333333 | 0 |
| 0.9152777777777777 | 0 |
| 0.9159722222222223 | 0 |
| 0.9166666666666666 | 0 |
| 0.9173611111111111 | 0 |
| 0.9180555555555556 | 0 |
| 0.9187500000000001 | 0 |
| 0.9194444444444444 | 0 |
| 0.9201388888888888 | 0 |
| 0.9208333333333334 | 0 |
| 0.9215277777777778 | 0 |
| 0.9222222222222222 | 0 |
| 0.9229166666666666 | 0 |
| 0.9236111111111112 | 0 |
| 0.9243055555555556 | 0 |
| 0.9249999999999999 | 0 |
| 0.9256944444444444 | 0 |
| 0.9263888888888889 | 0 |
| 0.9270833333333334 | 0 |
| 0.9277777777777777 | 0 |
| 0.9284722222222223 | 0 |
| 0.9291666666666667 | 0 |
| 0.9298611111111111 | 0 |
| 0.9305555555555555 | 0 |
| 0.93125 | 0 |
| 0.9319444444444445 | 0 |
| 0.9326388888888889 | 0 |
| 0.9333333333333332 | 0 |
| 0.9340277777777778 | 0 |
| 0.9347222222222222 | 0 |
| 0.9354166666666667 | 0 |
| 0.936111111111111 | 0 |
| 0.9368055555555556 | 0 |
| 0.9375 | 0 |
| 0.9381944444444444 | 0 |
| 0.938888888888889 | 0 |
| 0.9395833333333333 | 0 |
| 0.9402777777777778 | 0 |
| 0.9409722222222222 | 0 |
| 0.9416666666666668 | 0 |
| 0.9423611111111111 | 0 |
| 0.9430555555555555 | 0 |
| 0.94375 | 0 |
| 0.9444444444444445 | 0 |
| 0.9451388888888889 | 0 |
| 0.9458333333333333 | 0 |
| 0.9465277777777777 | 0 |
| 0.9472222222222223 | 0 |
| 0.9479166666666666 | 0 |
| 0.9486111111111111 | 0 |
| 0.9493055555555556 | 0 |
| 0.9500000000000001 | 0 |
| 0.9506944444444444 | 0 |
| 0.9513888888888888 | 0 |
| 0.9520833333333334 | 0 |
| 0.9527777777777778 | 0 |
| 0.9534722222222222 | 0 |
| 0.9541666666666666 | 0 |
| 0.9548611111111112 | 0 |
| 0.9555555555555556 | 0 |
| 0.9562499999999999 | 0 |
| 0.9569444444444444 | 0 |
| 0.9576388888888889 | 0 |
| 0.9583333333333334 | 0 |
| 0.9590277777777777 | 0 |
| 0.9597222222222223 | 0 |
| 0.9604166666666667 | 0 |
| 0.9611111111111111 | 0 |
| 0.9618055555555555 | 0 |
| 0.9625 | 0 |
| 0.9631944444444445 | 0 |
| 0.9638888888888889 | 0 |
| 0.9645833333333332 | 0 |
| 0.9652777777777778 | 0 |
| 0.9659722222222222 | 0 |
| 0.9666666666666667 | 0 |
| 0.967361111111111 | 0 |
| 0.9680555555555556 | 0 |
| 0.96875 | 0 |
| 0.9694444444444444 | 0 |
| 0.970138888888889 | 0 |
| 0.9708333333333333 | 0 |
| 0.9715277777777778 | 0 |
| 0.9722222222222222 | 0 |
| 0.9729166666666668 | 0 |
| 0.9736111111111111 | 0 |
| 0.9743055555555555 | 0 |
| 0.975 | 0 |
| 0.9756944444444445 | 0 |
| 0.9763888888888889 | 0 |
| 0.9770833333333333 | 0 |
| 0.9777777777777777 | 0 |
| 0.9784722222222223 | 0 |
| 0.9791666666666666 | 0 |
| 0.9798611111111111 | 0 |
| 0.9805555555555556 | 0 |
| 0.9812500000000001 | 0 |
| 0.9819444444444444 | 0 |
| 0.9826388888888888 | 0 |
| 0.9833333333333334 | 0 |
| 0.9840277777777778 | 0 |
| 0.9847222222222222 | 0 |
| 0.9854166666666666 | 0 |
| 0.9861111111111112 | 0 |
| 0.9868055555555556 | 0 |
| 0.9874999999999999 | 0 |
| 0.9881944444444444 | 0 |
| 0.9888888888888889 | 0 |
| 0.9895833333333334 | 0 |
| 0.9902777777777777 | 0 |
| 0.9909722222222223 | 0 |
| 0.9916666666666667 | 0 |
| 0.9923611111111111 | 0 |
| 0.9930555555555555 | 0 |
| 0.99375 | 0 |
| 0.9944444444444445 | 0 |
| 0.9951388888888889 | 0 |
| 0.9958333333333332 | 0 |
| 0.9965277777777778 | 0 |
| 0.9972222222222222 | 0 |
| 0.9979166666666667 | 0 |
| 0.998611111111111 | 0 |
| 0.9993055555555556 | 0 |